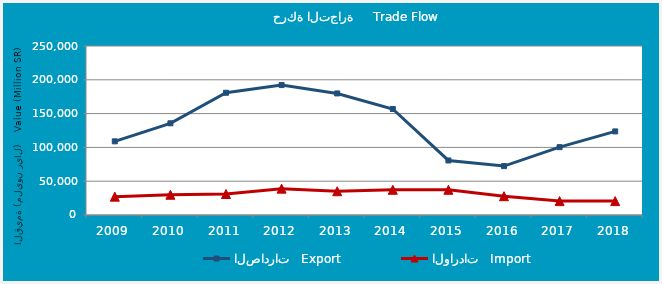
| Category | الصادرات   Export | الواردات   Import |
|---|---|---|
| 2009.0 | 108955562791 | 27142030403 |
| 2010.0 | 135633964803 | 29956530408 |
| 2011.0 | 180828030890 | 31064897876 |
| 2012.0 | 192201479929 | 38988506822 |
| 2013.0 | 179825355732 | 35153452131 |
| 2014.0 | 156821228290 | 37306115946 |
| 2015.0 | 80682659035 | 37286013756 |
| 2016.0 | 72342363619 | 27820758728 |
| 2017.0 | 100382168817 | 20568996431 |
| 2018.0 | 123645812997 | 20589631256 |